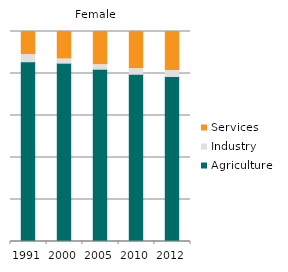
| Category | Agriculture | Industry | Services |
|---|---|---|---|
| 1991.0 | 85.594 | 3.433 | 10.973 |
| 2000.0 | 84.914 | 2.019 | 13.067 |
| 2005.0 | 82.046 | 2.186 | 15.767 |
| 2010.0 | 79.644 | 2.667 | 17.689 |
| 2012.0 | 78.568 | 2.873 | 18.559 |